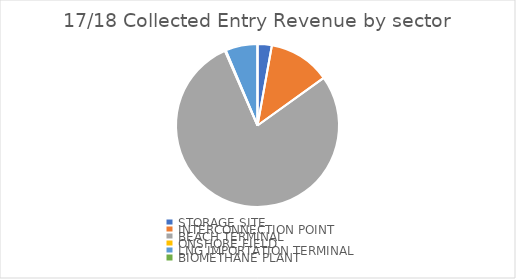
| Category | 01-Oct-2017 to 30-Sep-2018 |
|---|---|
| STORAGE SITE | 0.028 |
| INTERCONNECTION POINT | 0.122 |
| BEACH TERMINAL | 0.784 |
| ONSHORE FIELD | 0.002 |
| LNG IMPORTATION TERMINAL | 0.064 |
| BIOMETHANE PLANT | 0 |